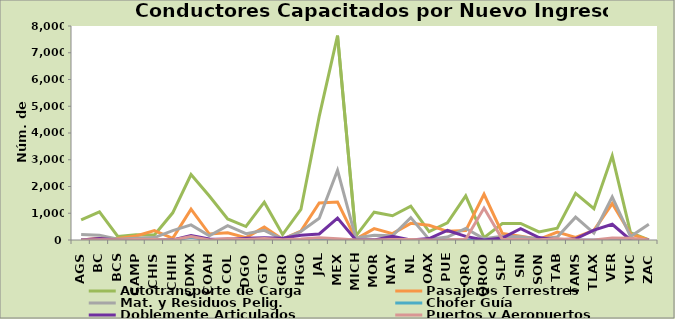
| Category | Autotransporte de Carga | Pasajeros Terrestres | Mat. y Residuos Pelig. | Chofer Guía | Doblemente Articulados | Puertos y Aeropuertos |
|---|---|---|---|---|---|---|
| AGS | 752 | 0 | 205 | 0 | 0 | 0 |
| BC | 1050 | 63 | 182 | 2 | 56 | 5 |
| BCS | 133 | 54 | 26 | 0 | 0 | 10 |
| CAMP | 199 | 153 | 63 | 4 | 0 | 17 |
| CHIS | 184 | 349 | 89 | 5 | 0 | 22 |
| CHIH | 1016 | 63 | 353 | 0 | 0 | 0 |
| CDMX | 2449 | 1151 | 563 | 101 | 168 | 134 |
| COAH | 1645 | 222 | 158 | 0 | 41 | 0 |
| COL | 789 | 270 | 537 | 0 | 24 | 54 |
| DGO | 504 | 88 | 238 | 0 | 61 | 21 |
| GTO | 1415 | 481 | 363 | 21 | 84 | 57 |
| GRO | 203 | 32 | 30 | 0 | 66 | 9 |
| HGO | 1142 | 330 | 316 | 0 | 174 | 35 |
| JAL | 4621 | 1383 | 810 | 0 | 225 | 83 |
| MEX | 7640 | 1422 | 2607 | 0 | 818 | 50 |
| MICH | 148 | 34 | 73 | 0 | 1 | 0 |
| MOR | 1040 | 424 | 179 | 0 | 5 | 1 |
| NAY | 907 | 238 | 158 | 0 | 140 | 15 |
| NL | 1262 | 622 | 836 | 3 | 2 | 15 |
| OAX | 312 | 551 | 24 | 0 | 56 | 3 |
| PUE | 639 | 325 | 108 | 0 | 357 | 7 |
| QRO | 1648 | 353 | 434 | 0 | 136 | 31 |
| QROO | 91 | 1710 | 43 | 0 | 0 | 1193 |
| SLP | 617 | 246 | 142 | 0 | 72 | 24 |
| SIN | 621 | 137 | 122 | 0 | 421 | 23 |
| SON | 304 | 26 | 38 | 0 | 92 | 6 |
| TAB | 440 | 299 | 110 | 0 | 3 | 47 |
| TAMS | 1748 | 100 | 855 | 0 | 43 | 13 |
| TLAX | 1170 | 359 | 254 | 0 | 369 | 0 |
| VER | 3148 | 1361 | 1610 | 14 | 589 | 76 |
| YUC | 279 | 227 | 129 | 22 | 0 | 65 |
| ZAC | 0 | 0 | 585 | 0 | 0 | 0 |